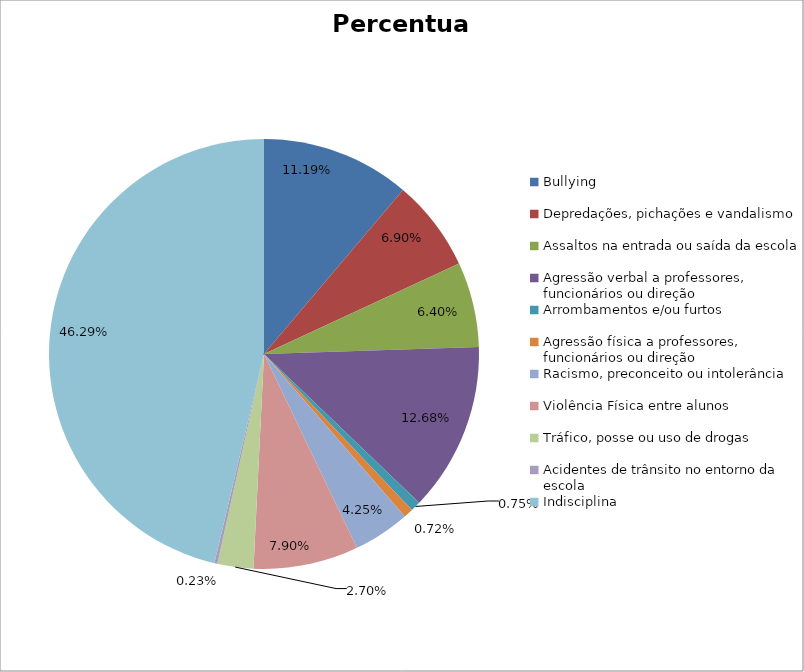
| Category | Percentual |
|---|---|
| Bullying | 0.112 |
| Depredações, pichações e vandalismo | 0.069 |
| Assaltos na entrada ou saída da escola | 0.064 |
| Agressão verbal a professores, funcionários ou direção | 0.127 |
| Arrombamentos e/ou furtos | 0.007 |
| Agressão física a professores, funcionários ou direção | 0.007 |
| Racismo, preconceito ou intolerância | 0.042 |
| Violência Física entre alunos | 0.079 |
| Tráfico, posse ou uso de drogas | 0.027 |
| Acidentes de trânsito no entorno da escola | 0.002 |
| Indisciplina | 0.463 |